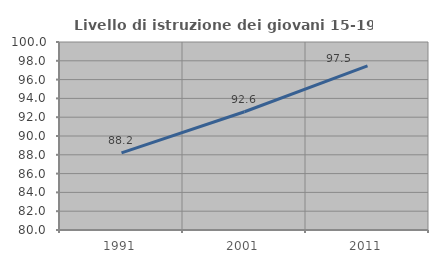
| Category | Livello di istruzione dei giovani 15-19 anni |
|---|---|
| 1991.0 | 88.2 |
| 2001.0 | 92.582 |
| 2011.0 | 97.452 |